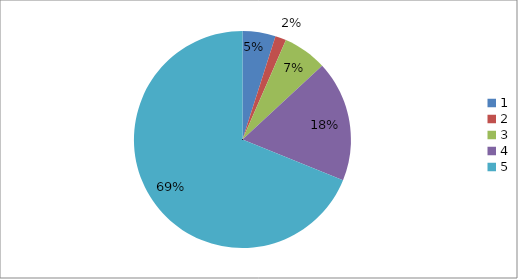
| Category | Series 0 |
|---|---|
| 0 | 0.049 |
| 1 | 0.016 |
| 2 | 0.066 |
| 3 | 0.18 |
| 4 | 0.689 |